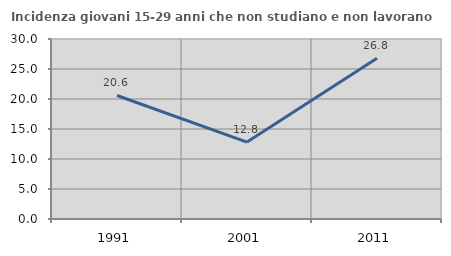
| Category | Incidenza giovani 15-29 anni che non studiano e non lavorano  |
|---|---|
| 1991.0 | 20.588 |
| 2001.0 | 12.821 |
| 2011.0 | 26.804 |